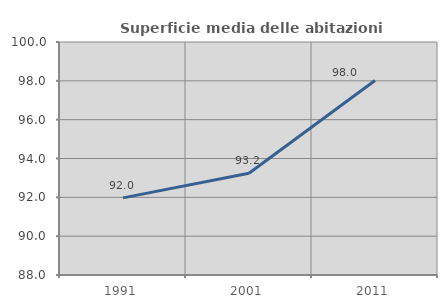
| Category | Superficie media delle abitazioni occupate |
|---|---|
| 1991.0 | 91.973 |
| 2001.0 | 93.241 |
| 2011.0 | 98.014 |